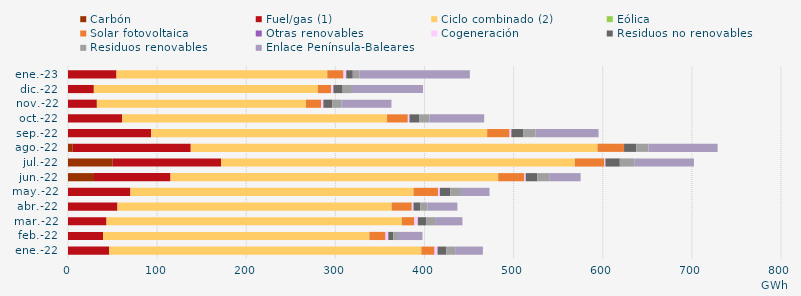
| Category | Carbón | Fuel/gas (1) | Ciclo combinado (2) | Eólica | Solar fotovoltaica | Otras renovables | Cogeneración | Residuos no renovables | Residuos renovables | Enlace Península-Baleares |
|---|---|---|---|---|---|---|---|---|---|---|
| ene.-22 | -0.627 | 46.217 | 350.087 | 0.216 | 14.437 | 0.285 | 3.401 | 9.871 | 9.871 | 31.159 |
| feb.-22 | -0.58 | 39.304 | 298.623 | 0.228 | 17.86 | 0.281 | 3.068 | 5.441 | 5.441 | 27.503 |
| mar.-22 | -0.669 | 43.218 | 331.001 | 0.338 | 13.718 | 0.291 | 3.993 | 9.663 | 9.663 | 30.689 |
| abr.-22 | -0.605 | 55.507 | 307.429 | 0.24 | 22.444 | 0.165 | 1.839 | 7.805 | 7.805 | 33.641 |
| may.-22 | -1.03 | 70.043 | 317.556 | 0.161 | 27.347 | 0.166 | 1.946 | 11.846 | 11.846 | 32.047 |
| jun.-22 | 29.142 | 85.898 | 367.588 | 0.061 | 29.226 | 0.111 | 1.536 | 13.186 | 13.186 | 35.225 |
| jul.-22 | 50.189 | 121.497 | 396.96 | 0.03 | 33.05 | 0.095 | 1.172 | 16.161 | 16.161 | 67.033 |
| ago.-22 | 5.265 | 132.464 | 456.377 | 0.032 | 29.653 | 0.057 | 0.051 | 13.672 | 13.672 | 77.653 |
| sep.-22 | -0.604 | 93.246 | 377.074 | 0.013 | 25.056 | 0.072 | 2.037 | 13.582 | 13.582 | 70.647 |
| oct.-22 | -0.613 | 60.669 | 297.321 | 0.003 | 23.236 | 0.097 | 1.827 | 11.231 | 11.231 | 61.365 |
| nov.-22 | -0.588 | 32.394 | 234.48 | 0.026 | 17.029 | 0.085 | 2.554 | 10.189 | 10.189 | 55.992 |
| dic.-22 | -0.627 | 28.98 | 251.185 | 0.101 | 14.8 | 0.077 | 2.62 | 10.414 | 10.414 | 79.779 |
| ene.-23 | -0.728 | 54.403 | 236.334 | 0.216 | 18.1 | 0.094 | 3.056 | 7.362 | 7.362 | 123.95 |